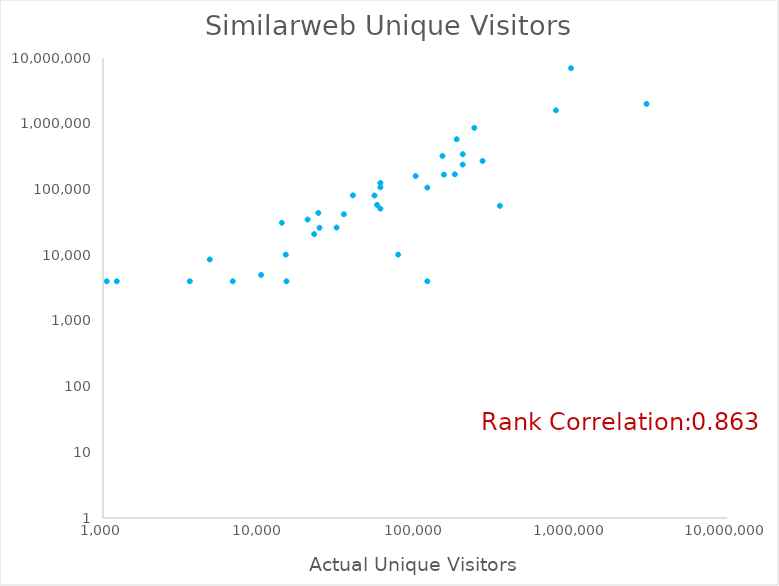
| Category | Similarweb Unique Visitors |
|---|---|
| 57127.0 | 58100 |
| 14843.0 | 10200 |
| 120000.0 | 106700 |
| 24000.0 | 43900 |
| 3600.0 | 4000 |
| 150000.0 | 323400 |
| 185000.0 | 580000 |
| 240080.0 | 865900 |
| 31412.0 | 26300 |
| 22569.0 | 20900 |
| 153037.0 | 168300 |
| 78000.0 | 10200 |
| 202000.0 | 238800 |
| 24417.0 | 26100 |
| 60000.0 | 51000 |
| 35000.0 | 42000 |
| 1000000.0 | 7000000 |
| 350000.0 | 56200 |
| 20485.0 | 34800 |
| 271059.0 | 270800 |
| 101000.0 | 159700 |
| 800000.0 | 1600000 |
| 60000.0 | 125600 |
| 180000.0 | 169700 |
| 15000.0 | 4000 |
| 14000.0 | 31100 |
| 55000.0 | 80700 |
| 1057.0 | 4000 |
| 10313.0 | 5000 |
| 1225.0 | 4000 |
| 60000.0 | 107700 |
| 6790.0 | 4000 |
| 202310.0 | 343400 |
| 40000.0 | 81400 |
| 120000.0 | 4000 |
| 3050000.0 | 2000000 |
| 4835.0 | 8600 |